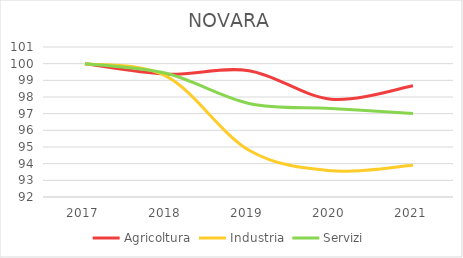
| Category | Agricoltura | Industria | Servizi |
|---|---|---|---|
| 2017.0 | 100 | 100 | 100 |
| 2018.0 | 99.372 | 99.224 | 99.406 |
| 2019.0 | 99.581 | 94.808 | 97.613 |
| 2020.0 | 97.87 | 93.575 | 97.313 |
| 2021.0 | 98.673 | 93.912 | 97.008 |